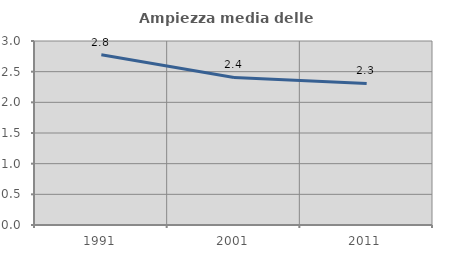
| Category | Ampiezza media delle famiglie |
|---|---|
| 1991.0 | 2.775 |
| 2001.0 | 2.406 |
| 2011.0 | 2.309 |